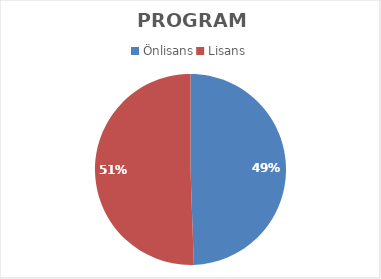
| Category | Series 0 |
|---|---|
| Önlisans | 177 |
| Lisans | 181 |